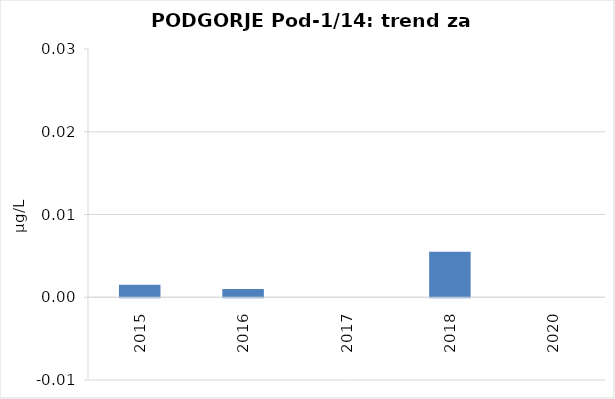
| Category | Vsota |
|---|---|
| 2015 | 0.002 |
| 2016 | 0.001 |
| 2017 | 0 |
| 2018 | 0.006 |
| 2020 | 0 |